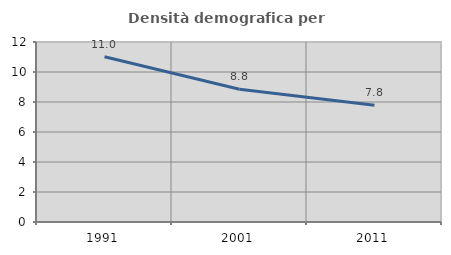
| Category | Densità demografica |
|---|---|
| 1991.0 | 11.016 |
| 2001.0 | 8.848 |
| 2011.0 | 7.782 |